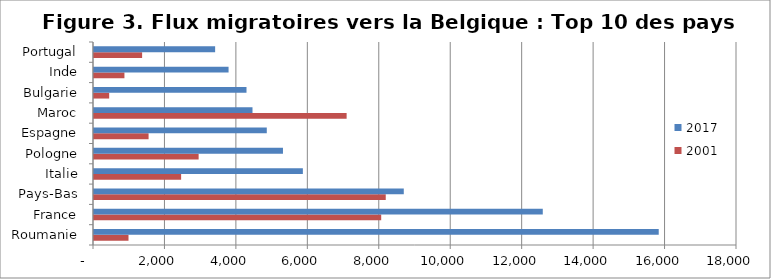
| Category | 2001 | 2017 |
|---|---|---|
| Roumanie | 966 | 15809 |
| France | 8040 | 12563 |
| Pays-Bas | 8167 | 8672 |
| Italie | 2439 | 5847 |
| Pologne | 2929 | 5290 |
| Espagne | 1528 | 4837 |
| Maroc | 7072 | 4437 |
| Bulgarie | 425 | 4269 |
| Inde | 852 | 3767 |
| Portugal | 1347 | 3391 |